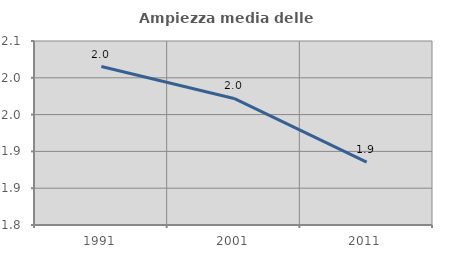
| Category | Ampiezza media delle famiglie |
|---|---|
| 1991.0 | 2.015 |
| 2001.0 | 1.972 |
| 2011.0 | 1.885 |